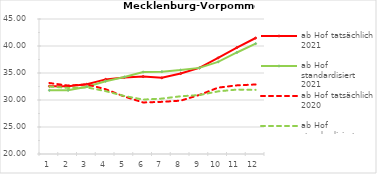
| Category | ab Hof tatsächlich 2021 | ab Hof standardisiert 2021 | ab Hof tatsächlich 2020 | ab Hof standardisiert 2020 |
|---|---|---|---|---|
| 0 | 32.55 | 31.792 | 33.143 | 32.501 |
| 1 | 32.563 | 31.798 | 32.673 | 32.237 |
| 2 | 32.926 | 32.46 | 32.888 | 32.329 |
| 3 | 33.82 | 33.482 | 31.997 | 31.647 |
| 4 | 34.174 | 34.261 | 30.641 | 30.74 |
| 5 | 34.339 | 35.175 | 29.547 | 30.082 |
| 6 | 34.106 | 35.247 | 29.657 | 30.26 |
| 7 | 34.893 | 35.546 | 29.878 | 30.69 |
| 8 | 35.955 | 35.949 | 30.936 | 30.917 |
| 9 | 37.8 | 37.059 | 32.289 | 31.596 |
| 10 | 39.712 | 38.801 | 32.712 | 31.929 |
| 11 | 41.48 | 40.437 | 32.873 | 31.875 |